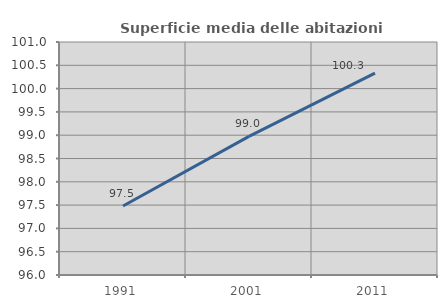
| Category | Superficie media delle abitazioni occupate |
|---|---|
| 1991.0 | 97.48 |
| 2001.0 | 98.975 |
| 2011.0 | 100.331 |